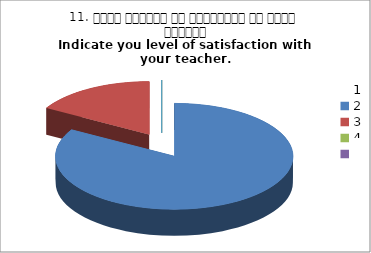
| Category | 11. अपने शिक्षक से संतुष्टि का स्तर बताइये
Indicate you level of satisfaction with your teacher.
 |
|---|---|
| 0 | 5 |
| 1 | 1 |
| 2 | 0 |
| 3 | 0 |
| 4 | 0 |